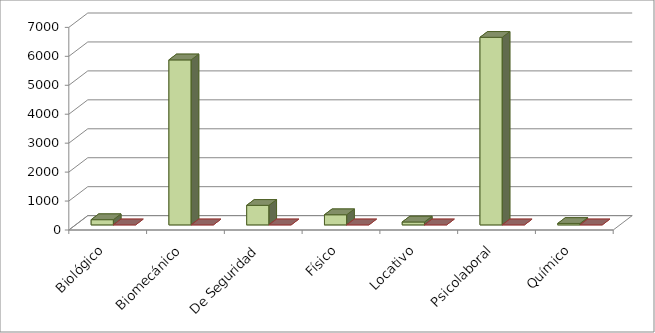
| Category | Series 0 | Series 1 |
|---|---|---|
| Biológico | 180 | 0 |
| Biomecánico | 5700 | 0 |
| De Seguridad | 675 | -75 |
| Físico | 350 | 0 |
| Locativo | 100 | 0 |
| Psicolaboral | 6480 | 0 |
| Químico | 50 | 0 |